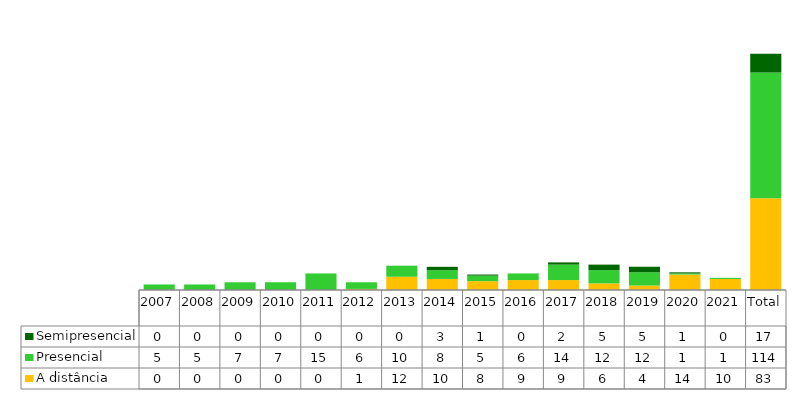
| Category | A distância | Presencial | Semipresencial |
|---|---|---|---|
| 2007 | 0 | 5 | 0 |
| 2008 | 0 | 5 | 0 |
| 2009 | 0 | 7 | 0 |
| 2010 | 0 | 7 | 0 |
| 2011 | 0 | 15 | 0 |
| 2012 | 1 | 6 | 0 |
| 2013 | 12 | 10 | 0 |
| 2014 | 10 | 8 | 3 |
| 2015 | 8 | 5 | 1 |
| 2016 | 9 | 6 | 0 |
| 2017 | 9 | 14 | 2 |
| 2018 | 6 | 12 | 5 |
| 2019 | 4 | 12 | 5 |
| 2020 | 14 | 1 | 1 |
| 2021 | 10 | 1 | 0 |
| Total | 83 | 114 | 17 |